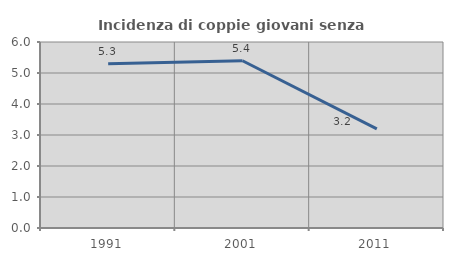
| Category | Incidenza di coppie giovani senza figli |
|---|---|
| 1991.0 | 5.297 |
| 2001.0 | 5.396 |
| 2011.0 | 3.197 |